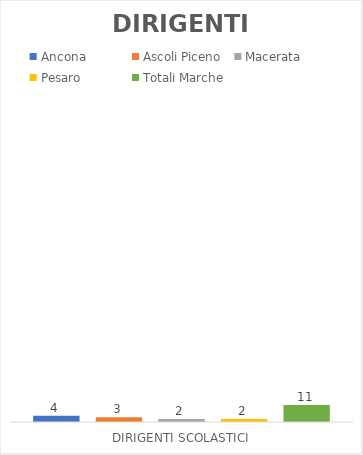
| Category | Ancona | Ascoli Piceno | Macerata | Pesaro | Totali Marche |
|---|---|---|---|---|---|
| DIRIGENTI SCOLASTICI | 4 | 3 | 2 | 2 | 11 |